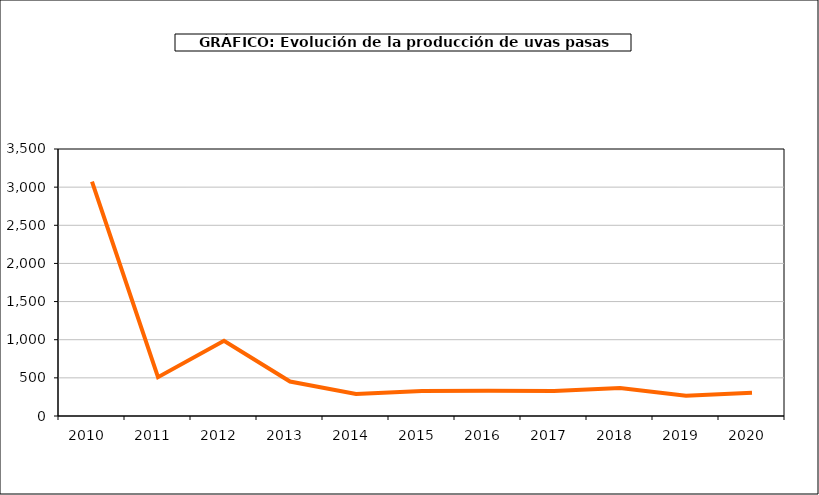
| Category | producción |
|---|---|
| 2010.0 | 3073 |
| 2011.0 | 509 |
| 2012.0 | 986 |
| 2013.0 | 452 |
| 2014.0 | 289 |
| 2015.0 | 328 |
| 2016.0 | 332 |
| 2017.0 | 328 |
| 2018.0 | 368 |
| 2019.0 | 265 |
| 2020.0 | 304 |